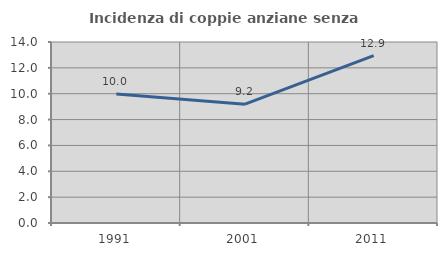
| Category | Incidenza di coppie anziane senza figli  |
|---|---|
| 1991.0 | 9.979 |
| 2001.0 | 9.194 |
| 2011.0 | 12.942 |